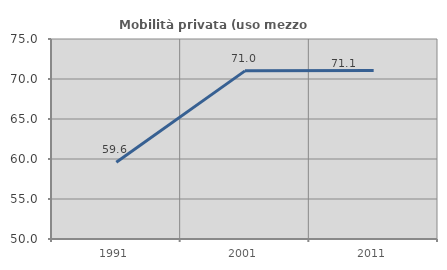
| Category | Mobilità privata (uso mezzo privato) |
|---|---|
| 1991.0 | 59.582 |
| 2001.0 | 71.017 |
| 2011.0 | 71.063 |